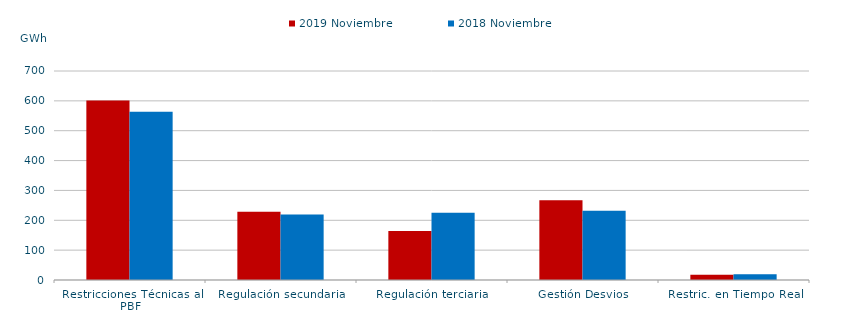
| Category | 2019 Noviembre | 2018 Noviembre |
|---|---|---|
| Restricciones Técnicas al PBF | 601.163 | 563.219 |
| Regulación secundaria | 228.826 | 218.965 |
| Regulación terciaria | 163.883 | 225.452 |
| Gestión Desvios | 267.461 | 231.601 |
| Restric. en Tiempo Real | 17.937 | 19.218 |